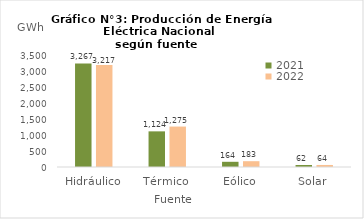
| Category | 2021 | 2022 |
|---|---|---|
| Hidráulico | 3267.007 | 3217.054 |
| Térmico | 1123.778 | 1275.205 |
| Eólico | 164.149 | 182.982 |
| Solar | 62.416 | 64.08 |